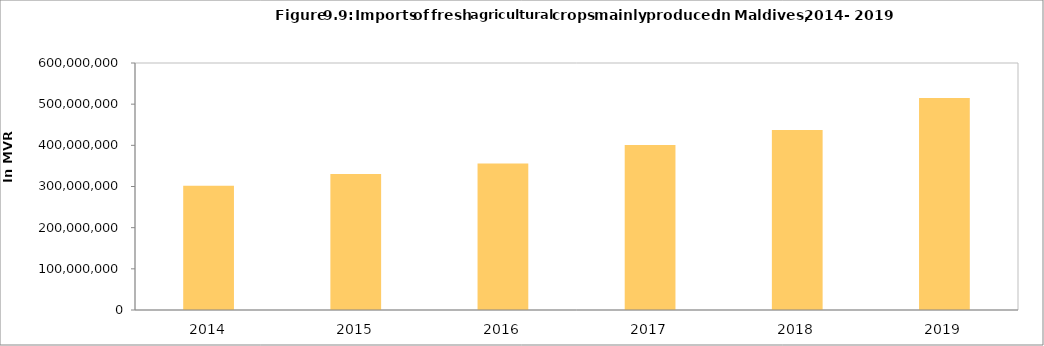
| Category | Series 0 |
|---|---|
| 2014.0 | 302002607.59 |
| 2015.0 | 330503715.94 |
| 2016.0 | 356030840.87 |
| 2017.0 | 400897835.123 |
| 2018.0 | 437440288.2 |
| 2019.0 | 514951812.51 |